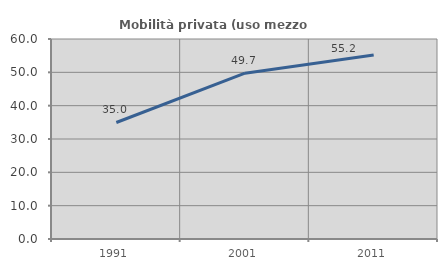
| Category | Mobilità privata (uso mezzo privato) |
|---|---|
| 1991.0 | 34.954 |
| 2001.0 | 49.739 |
| 2011.0 | 55.179 |